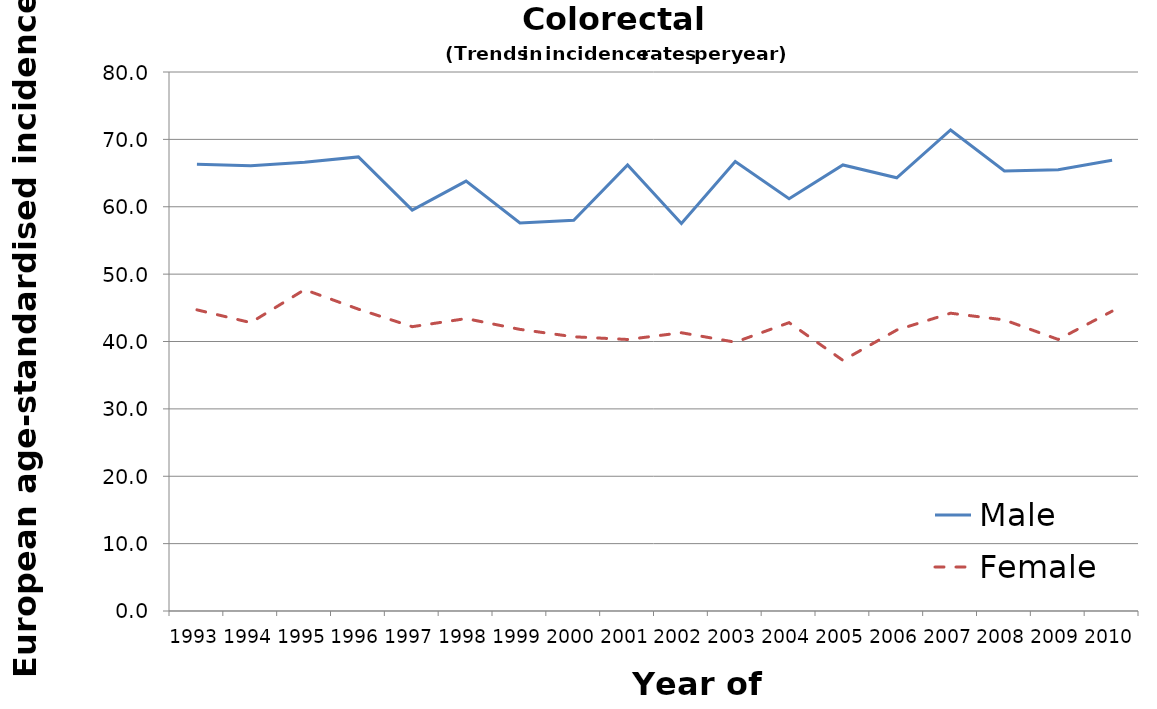
| Category | Male | Female |
|---|---|---|
| 1993.0 | 66.3 | 44.7 |
| 1994.0 | 66.1 | 42.8 |
| 1995.0 | 66.6 | 47.7 |
| 1996.0 | 67.4 | 44.8 |
| 1997.0 | 59.5 | 42.2 |
| 1998.0 | 63.8 | 43.4 |
| 1999.0 | 57.6 | 41.8 |
| 2000.0 | 58 | 40.7 |
| 2001.0 | 66.2 | 40.3 |
| 2002.0 | 57.5 | 41.3 |
| 2003.0 | 66.7 | 39.9 |
| 2004.0 | 61.2 | 42.8 |
| 2005.0 | 66.2 | 37.2 |
| 2006.0 | 64.3 | 41.7 |
| 2007.0 | 71.4 | 44.2 |
| 2008.0 | 65.3 | 43.2 |
| 2009.0 | 65.5 | 40.3 |
| 2010.0 | 66.9 | 44.5 |